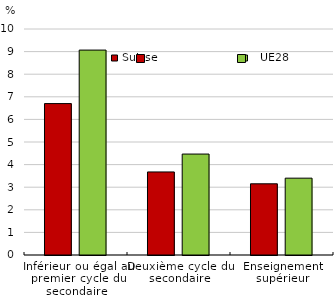
| Category | Suisse |   UE28 |
|---|---|---|
| Inférieur ou égal au premier cycle du secondaire | 6.7 | 9.067 |
| Deuxième cycle du secondaire | 3.675 | 4.467 |
| Enseignement supérieur | 3.15 | 3.4 |